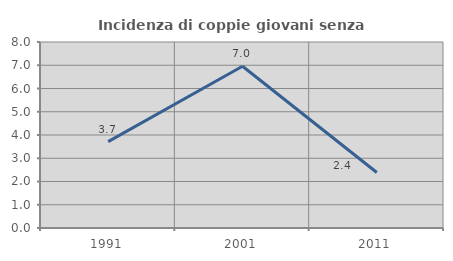
| Category | Incidenza di coppie giovani senza figli |
|---|---|
| 1991.0 | 3.716 |
| 2001.0 | 6.957 |
| 2011.0 | 2.387 |